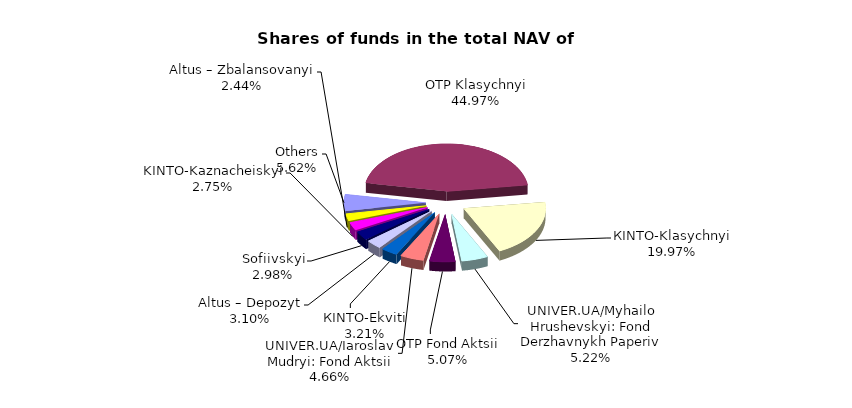
| Category | Series 0 | Series 1 |
|---|---|---|
| Others | 8775654.49 | 0.056 |
| OTP Klasychnyi | 70208173.03 | 0.45 |
| КІNТО-Klasychnyi | 31183400.91 | 0.2 |
| UNIVER.UA/Myhailo Hrushevskyi: Fond Derzhavnykh Paperiv | 8156785.92 | 0.052 |
| OTP Fond Aktsii | 7913279.63 | 0.051 |
| UNIVER.UA/Iaroslav Mudryi: Fond Aktsii | 7276474.07 | 0.047 |
| КІNTO-Ekviti | 5017177.43 | 0.032 |
| Altus – Depozyt | 4833502.22 | 0.031 |
| Sofiivskyi | 4649763.485 | 0.03 |
| KINTO-Kaznacheiskyi | 4297159.49 | 0.028 |
| Altus – Zbalansovanyi | 3805920.39 | 0.024 |